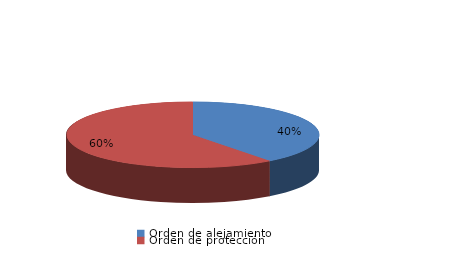
| Category | Series 0 |
|---|---|
| Orden de alejamiento | 38 |
| Orden de protección | 58 |